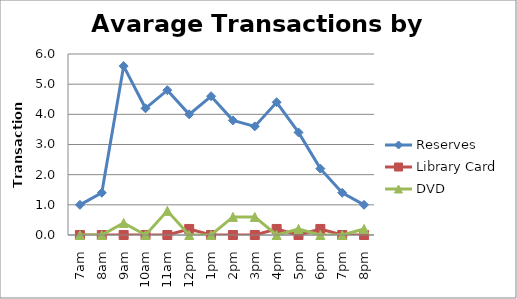
| Category | Reserves | Library Card | DVD |
|---|---|---|---|
| 7am | 1 | 0 | 0 |
| 8am | 1.4 | 0 | 0 |
| 9am | 5.6 | 0 | 0.4 |
| 10am | 4.2 | 0 | 0 |
| 11am | 4.8 | 0 | 0.8 |
| 12pm | 4 | 0.2 | 0 |
| 1pm | 4.6 | 0 | 0 |
| 2pm | 3.8 | 0 | 0.6 |
| 3pm | 3.6 | 0 | 0.6 |
| 4pm | 4.4 | 0.2 | 0 |
| 5pm | 3.4 | 0 | 0.2 |
| 6pm | 2.2 | 0.2 | 0 |
| 7pm | 1.4 | 0 | 0 |
| 8pm | 1 | 0 | 0.2 |